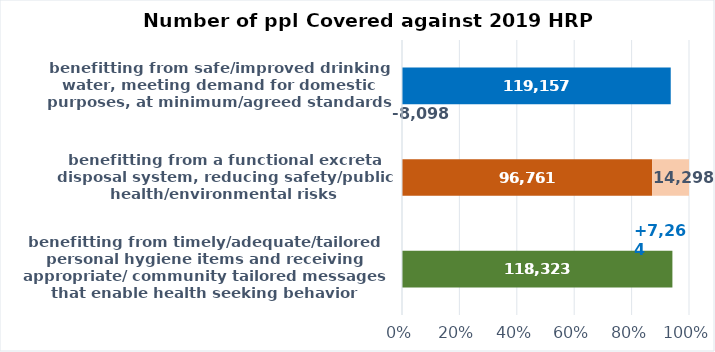
| Category | Coverage | Gap |
|---|---|---|
| benefitting from timely/adequate/tailored personal hygiene items and receiving appropriate/ community tailored messages that enable health seeking behavior | 118323 | -7264 |
| benefitting from a functional excreta disposal system, reducing safety/public health/environmental risks | 96761 | 14298 |
| benefitting from safe/improved drinking water, meeting demand for domestic purposes, at minimum/agreed standards | 119157 | -8098 |